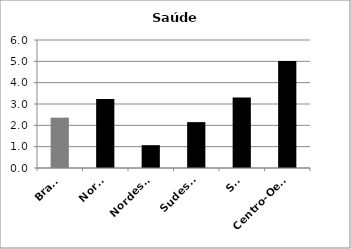
| Category | Saúde |
|---|---|
| Brasil | 2.36 |
| Norte | 3.23 |
| Nordeste | 1.07 |
| Sudeste | 2.15 |
| Sul | 3.3 |
| Centro-Oeste | 5.01 |